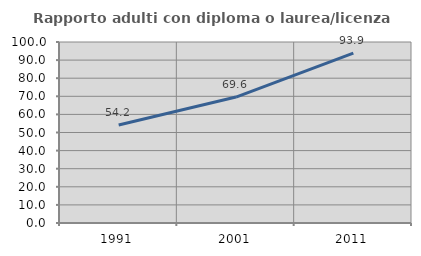
| Category | Rapporto adulti con diploma o laurea/licenza media  |
|---|---|
| 1991.0 | 54.15 |
| 2001.0 | 69.587 |
| 2011.0 | 93.874 |